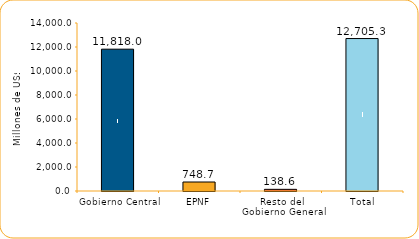
| Category | Series 1 |
|---|---|
| Gobierno Central | 11818 |
| EPNF | 748.7 |
| Resto del Gobierno General | 138.6 |
| Total | 12705.3 |